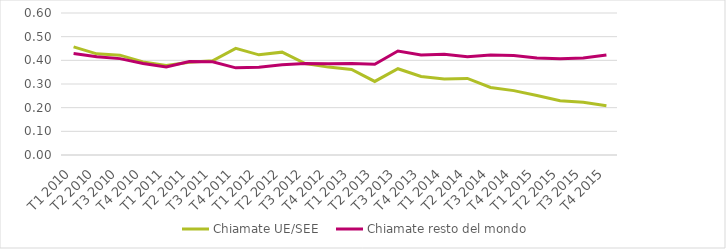
| Category | Chiamate UE/SEE | Chiamate resto del mondo  |
|---|---|---|
| T1 2010 | 0.457 | 0.429 |
| T2 2010 | 0.427 | 0.415 |
| T3 2010 | 0.422 | 0.407 |
| T4 2010 | 0.393 | 0.386 |
| T1 2011 | 0.378 | 0.372 |
| T2 2011 | 0.392 | 0.395 |
| T3 2011 | 0.398 | 0.394 |
| T4 2011 | 0.451 | 0.368 |
| T1 2012 | 0.423 | 0.371 |
| T2 2012 | 0.435 | 0.382 |
| T3 2012 | 0.386 | 0.387 |
| T4 2012 | 0.371 | 0.386 |
| T1 2013 | 0.361 | 0.387 |
| T2 2013 | 0.311 | 0.383 |
| T3 2013 | 0.364 | 0.439 |
| T4 2013 | 0.332 | 0.422 |
| T1 2014 | 0.321 | 0.425 |
| T2 2014 | 0.323 | 0.415 |
| T3 2014 | 0.285 | 0.422 |
| T4 2014 | 0.272 | 0.42 |
| T1 2015 | 0.252 | 0.41 |
| T2 2015 | 0.229 | 0.406 |
| T3 2015 | 0.222 | 0.41 |
| T4 2015 | 0.208 | 0.423 |